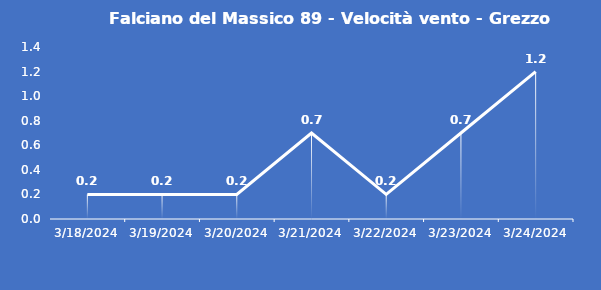
| Category | Falciano del Massico 89 - Velocità vento - Grezzo (m/s) |
|---|---|
| 3/18/24 | 0.2 |
| 3/19/24 | 0.2 |
| 3/20/24 | 0.2 |
| 3/21/24 | 0.7 |
| 3/22/24 | 0.2 |
| 3/23/24 | 0.7 |
| 3/24/24 | 1.2 |